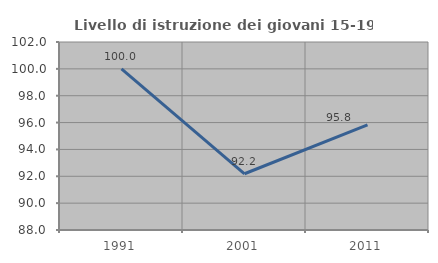
| Category | Livello di istruzione dei giovani 15-19 anni |
|---|---|
| 1991.0 | 100 |
| 2001.0 | 92.188 |
| 2011.0 | 95.833 |